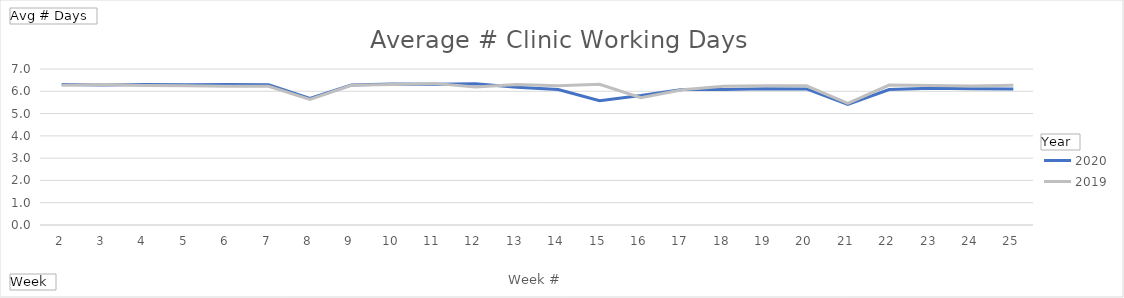
| Category | 2020 | 2019 |
|---|---|---|
| 2 | 6.301 | 6.269 |
| 3 | 6.28 | 6.301 |
| 4 | 6.301 | 6.258 |
| 5 | 6.29 | 6.247 |
| 6 | 6.301 | 6.226 |
| 7 | 6.29 | 6.226 |
| 8 | 5.677 | 5.634 |
| 9 | 6.28 | 6.269 |
| 10 | 6.323 | 6.301 |
| 11 | 6.312 | 6.355 |
| 12 | 6.333 | 6.194 |
| 13 | 6.183 | 6.301 |
| 14 | 6.075 | 6.247 |
| 15 | 5.581 | 6.312 |
| 16 | 5.806 | 5.71 |
| 17 | 6.075 | 6.065 |
| 18 | 6.075 | 6.226 |
| 19 | 6.118 | 6.247 |
| 20 | 6.108 | 6.247 |
| 21 | 5.409 | 5.462 |
| 22 | 6.075 | 6.28 |
| 23 | 6.14 | 6.258 |
| 24 | 6.118 | 6.237 |
| 25 | 6.108 | 6.269 |